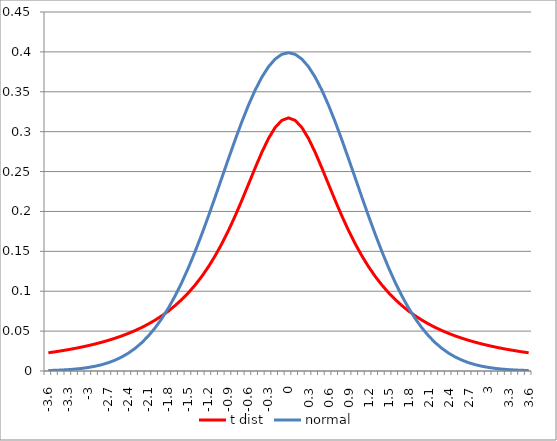
| Category | t dist | normal |
|---|---|---|
| -3.6 | 0.023 | 0.001 |
| -3.5 | 0.024 | 0.001 |
| -3.4 | 0.025 | 0.001 |
| -3.3 | 0.027 | 0.002 |
| -3.2 | 0.028 | 0.002 |
| -3.1 | 0.03 | 0.003 |
| -3.0 | 0.032 | 0.004 |
| -2.9 | 0.034 | 0.006 |
| -2.8 | 0.036 | 0.008 |
| -2.7 | 0.038 | 0.01 |
| -2.6 | 0.041 | 0.014 |
| -2.5 | 0.044 | 0.018 |
| -2.4 | 0.047 | 0.022 |
| -2.3 | 0.051 | 0.028 |
| -2.2 | 0.055 | 0.035 |
| -2.1 | 0.059 | 0.044 |
| -2.0 | 0.064 | 0.054 |
| -1.9 | 0.069 | 0.066 |
| -1.8 | 0.075 | 0.079 |
| -1.7 | 0.082 | 0.094 |
| -1.6 | 0.09 | 0.111 |
| -1.5 | 0.098 | 0.13 |
| -1.4 | 0.108 | 0.15 |
| -1.3 | 0.119 | 0.171 |
| -1.2 | 0.131 | 0.194 |
| -1.1 | 0.144 | 0.218 |
| -1.0 | 0.159 | 0.242 |
| -0.9 | 0.176 | 0.266 |
| -0.8 | 0.194 | 0.29 |
| -0.7 | 0.214 | 0.312 |
| -0.6 | 0.234 | 0.333 |
| -0.5 | 0.255 | 0.352 |
| -0.4 | 0.274 | 0.368 |
| -0.3 | 0.291 | 0.381 |
| -0.2 | 0.305 | 0.391 |
| -0.1 | 0.314 | 0.397 |
| 0.0 | 0.317 | 0.399 |
| 0.1 | 0.314 | 0.397 |
| 0.2 | 0.305 | 0.391 |
| 0.3 | 0.291 | 0.381 |
| 0.4 | 0.274 | 0.368 |
| 0.5 | 0.255 | 0.352 |
| 0.6 | 0.234 | 0.333 |
| 0.7 | 0.214 | 0.312 |
| 0.8 | 0.194 | 0.29 |
| 0.9 | 0.176 | 0.266 |
| 1.0 | 0.159 | 0.242 |
| 1.1 | 0.144 | 0.218 |
| 1.2 | 0.131 | 0.194 |
| 1.3 | 0.119 | 0.171 |
| 1.4 | 0.108 | 0.15 |
| 1.5 | 0.098 | 0.13 |
| 1.6 | 0.09 | 0.111 |
| 1.7 | 0.082 | 0.094 |
| 1.8 | 0.075 | 0.079 |
| 1.90000000000001 | 0.069 | 0.066 |
| 2.0 | 0.064 | 0.054 |
| 2.1 | 0.059 | 0.044 |
| 2.20000000000001 | 0.055 | 0.035 |
| 2.30000000000001 | 0.051 | 0.028 |
| 2.40000000000001 | 0.047 | 0.022 |
| 2.5 | 0.044 | 0.018 |
| 2.60000000000001 | 0.041 | 0.014 |
| 2.70000000000001 | 0.038 | 0.01 |
| 2.80000000000001 | 0.036 | 0.008 |
| 2.90000000000001 | 0.034 | 0.006 |
| 3.00000000000001 | 0.032 | 0.004 |
| 3.10000000000001 | 0.03 | 0.003 |
| 3.20000000000001 | 0.028 | 0.002 |
| 3.30000000000001 | 0.027 | 0.002 |
| 3.40000000000001 | 0.025 | 0.001 |
| 3.50000000000001 | 0.024 | 0.001 |
| 3.60000000000001 | 0.023 | 0.001 |